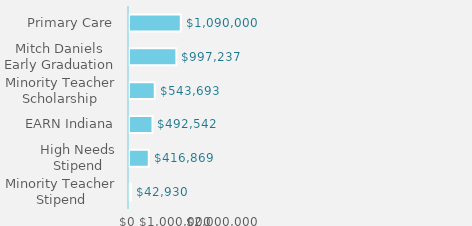
| Category | Series 0 |
|---|---|
| Minority Teacher Stipend | 42929.67 |
| High Needs Stipend | 416869.44 |
| EARN Indiana | 492542.33 |
| Minority Teacher Scholarship | 543693 |
| Mitch Daniels Early Graduation | 997236.5 |
| Primary Care | 1090000 |